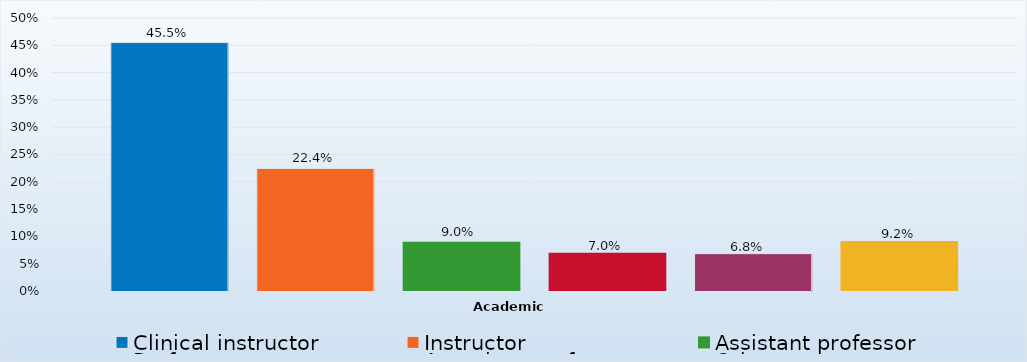
| Category | Clinical instructor | Instructor | Assistant professor | Professor | Associate professor | Other |
|---|---|---|---|---|---|---|
| 0 | 0.455 | 0.224 | 0.09 | 0.07 | 0.068 | 0.092 |